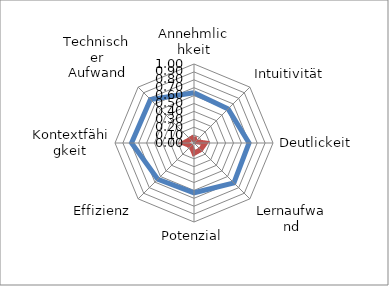
| Category | TPC2 | Series 1 |
|---|---|---|
| Annehmlichkeit | 0.635 | 0.079 |
| Intuitivität | 0.611 | 0.025 |
| Deutlickeit | 0.696 | 0.145 |
| Lernaufwand | 0.714 | 0.119 |
| Potenzial | 0.63 | 0.131 |
| Effizienz | 0.648 | 0.054 |
| Kontextfähigkeit | 0.79 | 0.132 |
| Technischer Aufwand | 0.78 | 0.065 |